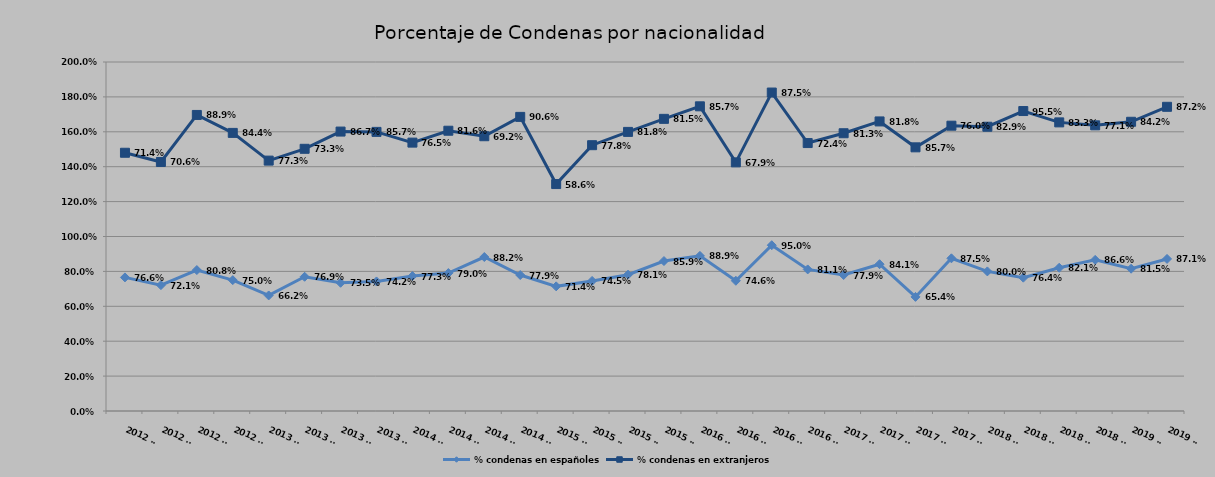
| Category | % condenas en españoles | % condenas en extranjeros |
|---|---|---|
| 2012 T1 | 0.766 | 0.714 |
| 2012 T2 | 0.721 | 0.706 |
| 2012 T3 | 0.808 | 0.889 |
| 2012 T4 | 0.75 | 0.844 |
| 2013 T1 | 0.662 | 0.773 |
| 2013 T2 | 0.769 | 0.733 |
| 2013 T3 | 0.735 | 0.867 |
| 2013 T4 | 0.742 | 0.857 |
| 2014 T1 | 0.773 | 0.765 |
| 2014 T2 | 0.79 | 0.816 |
| 2014 T3 | 0.882 | 0.692 |
| 2014 T4 | 0.779 | 0.906 |
| 2015 T1 | 0.714 | 0.586 |
| 2015 T2 | 0.745 | 0.778 |
| 2015 T3 | 0.781 | 0.818 |
| 2015 T4 | 0.859 | 0.815 |
| 2016 T1 | 0.889 | 0.857 |
| 2016 T2 | 0.746 | 0.679 |
| 2016 T3 | 0.95 | 0.875 |
| 2016 T4 | 0.811 | 0.724 |
| 2017 T1 | 0.779 | 0.812 |
| 2017 T2 | 0.841 | 0.818 |
| 2017 T3 | 0.654 | 0.857 |
| 2017 T4 | 0.875 | 0.76 |
| 2018 T1 | 0.8 | 0.829 |
| 2018 T2 | 0.764 | 0.955 |
| 2018 T3 | 0.821 | 0.833 |
| 2018 T4 | 0.866 | 0.771 |
| 2019 T1 | 0.815 | 0.842 |
| 2019 T2 | 0.871 | 0.872 |